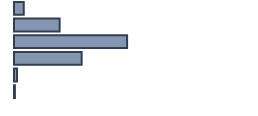
| Category | Percentatge |
|---|---|
| 0 | 4.015 |
| 1 | 19.015 |
| 2 | 47.121 |
| 3 | 28.182 |
| 4 | 1.288 |
| 5 | 0.379 |